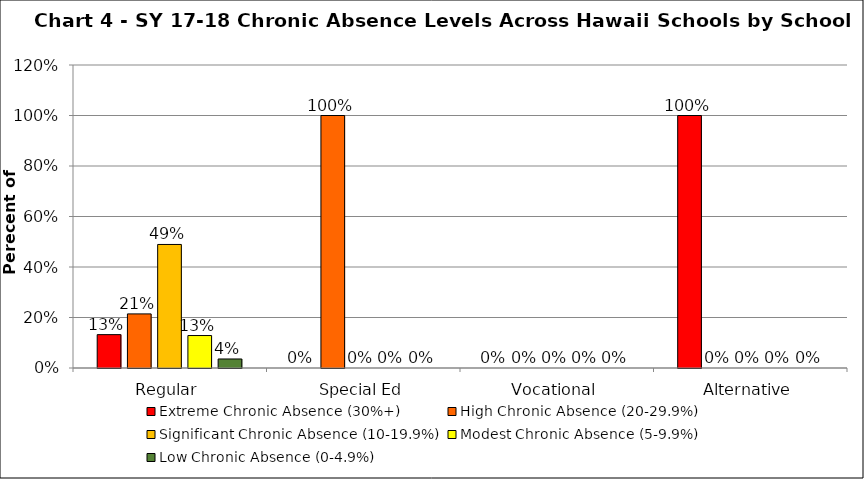
| Category | Extreme Chronic Absence (30%+) | High Chronic Absence (20-29.9%) | Significant Chronic Absence (10-19.9%) | Modest Chronic Absence (5-9.9%) | Low Chronic Absence (0-4.9%) |
|---|---|---|---|---|---|
| 0 | 0.132 | 0.214 | 0.489 | 0.129 | 0.036 |
| 1 | 0 | 1 | 0 | 0 | 0 |
| 2 | 0 | 0 | 0 | 0 | 0 |
| 3 | 1 | 0 | 0 | 0 | 0 |